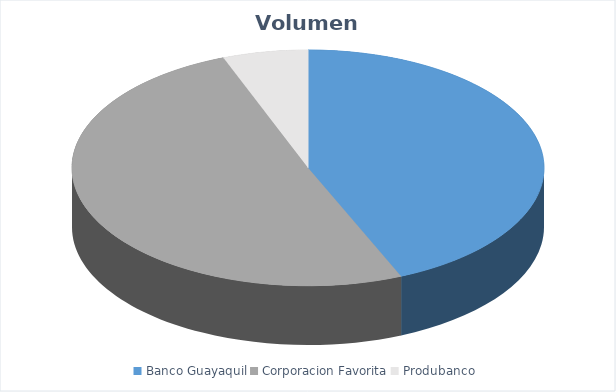
| Category | VOLUMEN ($USD) |
|---|---|
| Banco Guayaquil | 86560.36 |
| Corporacion Favorita | 100597.98 |
| Produbanco | 11608.8 |